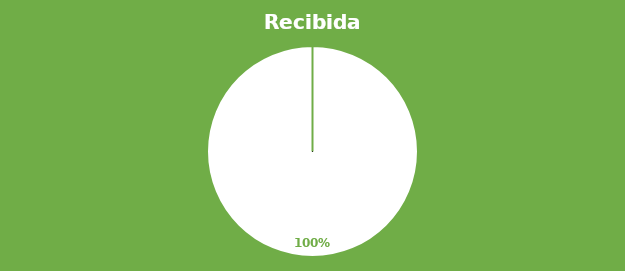
| Category | SOLICITUDES Recibidas  | SOLICITUDES Atendidas | SOLICITUDES Pendientes  | SOLICITUDES Rechazadas |
|---|---|---|---|---|
| TOTAL | 3 | 3 | 0 | 0 |